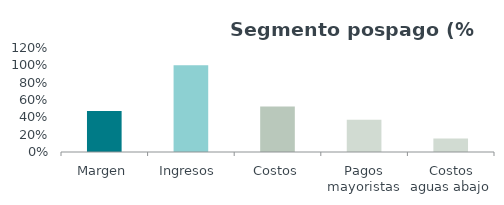
| Category | Series 0 |
|---|---|
| Margen | 0.474 |
| Ingresos  | 1 |
| Costos | 0.526 |
| Pagos mayoristas | 0.371 |
| Costos aguas abajo | 0.154 |